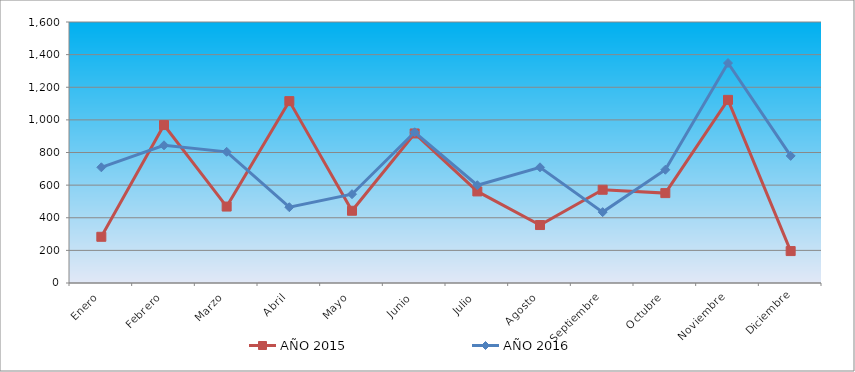
| Category | AÑO 2015 | AÑO 2016 |
|---|---|---|
| Enero | 283.241 | 709.232 |
| Febrero | 968.168 | 844.086 |
| Marzo | 468.634 | 804.129 |
| Abril | 1114.938 | 464.497 |
| Mayo | 442.885 | 544.41 |
| Junio | 916.67 | 923.999 |
| Julio | 561.331 | 599.351 |
| Agosto | 355.338 | 709.232 |
| Septiembre | 571.631 | 434.529 |
| Octubre | 551.032 | 694.248 |
| Noviembre | 1122.663 | 1348.539 |
| Diciembre | 195.694 | 779.156 |